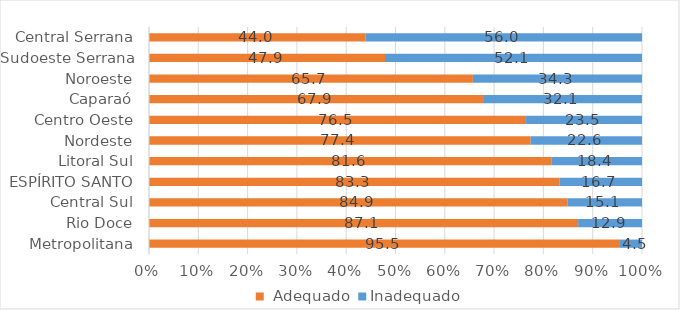
| Category |  Adequado | Inadequado |
|---|---|---|
| Metropolitana | 95.526 | 4.474 |
| Rio Doce | 87.051 | 12.949 |
| Central Sul | 84.874 | 15.126 |
| ESPÍRITO SANTO | 83.274 | 16.726 |
| Litoral Sul | 81.602 | 18.398 |
| Nordeste | 77.419 | 22.581 |
| Centro Oeste | 76.491 | 23.509 |
| Caparaó | 67.949 | 32.051 |
| Noroeste | 65.702 | 34.298 |
| Sudoeste Serrana | 47.87 | 52.13 |
| Central Serrana | 43.952 | 56.048 |